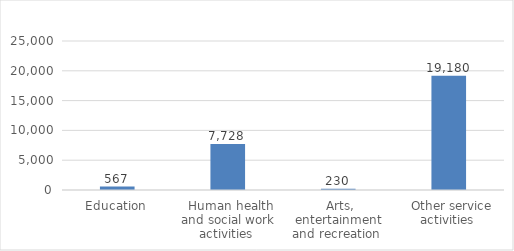
| Category |  Employees  |
|---|---|
| Education | 566.8 |
| Human health and social work activities | 7727.7 |
| Arts, entertainment and recreation | 230.3 |
| Other service activities | 19179.8 |